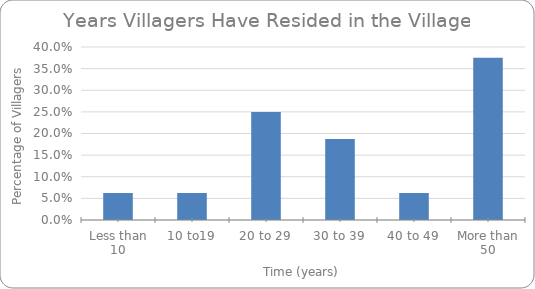
| Category | Series 0 |
|---|---|
| Less than 10 | 0.062 |
| 10 to19 | 0.062 |
| 20 to 29 | 0.25 |
| 30 to 39 | 0.188 |
| 40 to 49 | 0.062 |
| More than 50 | 0.375 |